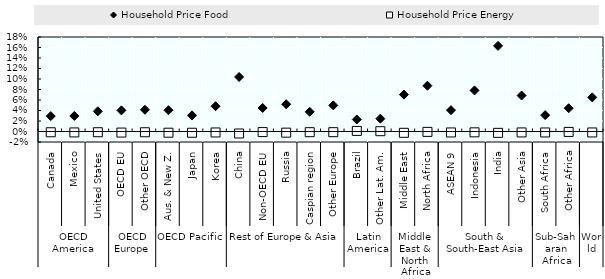
| Category | Household Price Food | Household Price Energy |
|---|---|---|
| 0 | 0.029 | -0.001 |
| 1 | 0.03 | -0.002 |
| 2 | 0.038 | -0.001 |
| 3 | 0.04 | -0.002 |
| 4 | 0.041 | -0.001 |
| 5 | 0.041 | -0.002 |
| 6 | 0.031 | -0.002 |
| 7 | 0.048 | -0.002 |
| 8 | 0.104 | -0.004 |
| 9 | 0.045 | -0.001 |
| 10 | 0.052 | -0.002 |
| 11 | 0.038 | -0.001 |
| 12 | 0.05 | -0.001 |
| 13 | 0.023 | 0.001 |
| 14 | 0.024 | 0.001 |
| 15 | 0.07 | -0.002 |
| 16 | 0.087 | -0.001 |
| 17 | 0.041 | -0.002 |
| 18 | 0.078 | -0.002 |
| 19 | 0.163 | -0.003 |
| 20 | 0.069 | -0.002 |
| 21 | 0.031 | -0.002 |
| 22 | 0.044 | -0.001 |
| 23 | 0.065 | -0.002 |